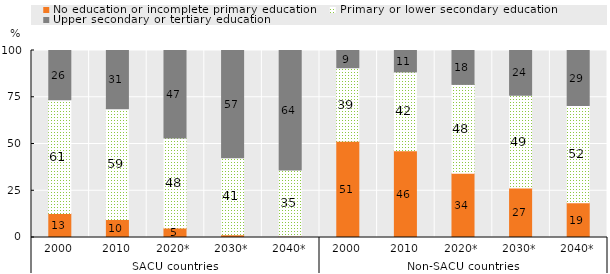
| Category | No education or incomplete primary education | Primary or lower secondary education | Upper secondary or tertiary education |
|---|---|---|---|
| 0 | 12.842 | 60.777 | 26.381 |
| 1 | 9.65 | 59.165 | 31.185 |
| 2 | 5.048 | 48.157 | 46.795 |
| 3 | 1.524 | 41.084 | 57.391 |
| 4 | 0.659 | 35.428 | 63.913 |
| 5 | 51.408 | 39.39 | 9.202 |
| 6 | 46.39 | 42.152 | 11.458 |
| 7 | 34.294 | 47.576 | 18.13 |
| 8 | 26.527 | 49.482 | 23.992 |
| 9 | 18.614 | 51.95 | 29.436 |